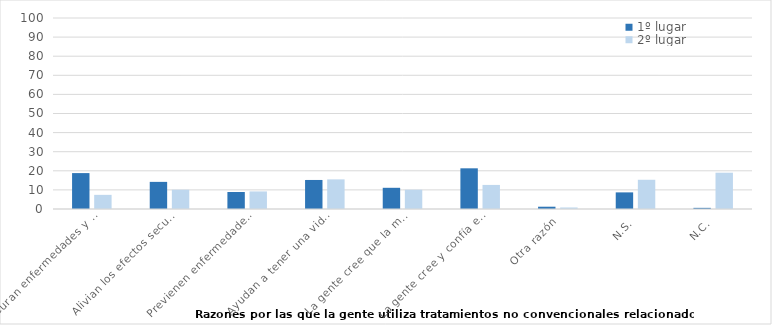
| Category | 1º lugar | 2º lugar |
|---|---|---|
| Curan enfermedades y dolencias para las que la medicina convencional no funciona | 18.8 | 7.4 |
| Alivian los efectos secundarios de los tratamientos médicos convencionales (con medicinas) | 14.2 | 10.1 |
| Previenen enfermedades y dolencias | 8.9 | 9.2 |
| Ayudan a tener una vida sana y equilibrada | 15.2 | 15.5 |
| La gente cree que la medicina convencional a veces es perjudicial para la salud | 11.1 | 10.1 |
| La gente cree y confía en ellas sin un motivo concreto | 21.3 | 12.6 |
| Otra razón | 1.2 | 0.8 |
| N.S. | 8.7 | 15.3 |
| N.C. | 0.6 | 19 |